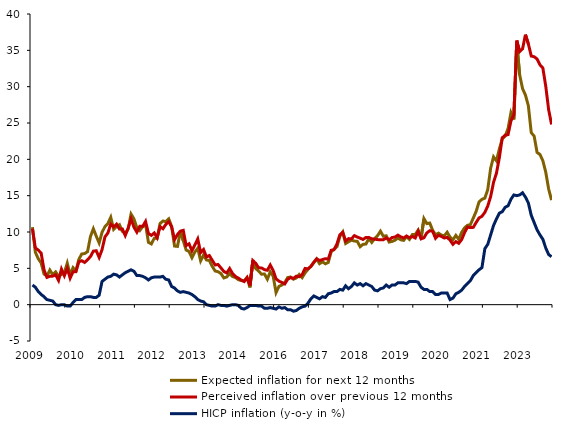
| Category | Expected inflation for next 12 months | Perceived inflation over previous 12 months | HICP inflation (y-o-y in %) |
|---|---|---|---|
| 2009.0 | 10.664 | 10.437 | 2.7 |
| 2009.0 | 7.216 | 7.817 | 2.4 |
| 2009.0 | 6.328 | 7.508 | 1.8 |
| 2009.0 | 5.742 | 7.104 | 1.4 |
| 2009.0 | 4.207 | 4.783 | 1.1 |
| 2009.0 | 3.94 | 3.754 | 0.7 |
| 2009.0 | 4.763 | 3.907 | 0.6 |
| 2009.0 | 4.114 | 3.928 | 0.5 |
| 2009.0 | 4.502 | 4.106 | 0 |
| 2009.0 | 3.904 | 3.337 | -0.1 |
| 2009.0 | 4.159 | 4.896 | 0 |
| 2009.0 | 4.402 | 3.978 | 0 |
| 2010.0 | 5.704 | 4.999 | -0.2 |
| 2010.0 | 4.108 | 3.649 | -0.2 |
| 2010.0 | 5.093 | 4.537 | 0.3 |
| 2010.0 | 4.675 | 4.548 | 0.7 |
| 2010.0 | 6.24 | 5.9 | 0.7 |
| 2010.0 | 6.977 | 6.044 | 0.7 |
| 2010.0 | 7.032 | 5.81 | 1 |
| 2010.0 | 7.3 | 6.188 | 1.1 |
| 2010.0 | 9.369 | 6.615 | 1.1 |
| 2010.0 | 10.447 | 7.367 | 1 |
| 2010.0 | 9.429 | 7.423 | 1 |
| 2010.0 | 8.498 | 6.502 | 1.3 |
| 2011.0 | 9.951 | 7.57 | 3.2 |
| 2011.0 | 10.738 | 9.322 | 3.5 |
| 2011.0 | 11.151 | 9.851 | 3.8 |
| 2011.0 | 12.023 | 11.08 | 3.9 |
| 2011.0 | 10.374 | 10.702 | 4.2 |
| 2011.0 | 10.778 | 11.078 | 4.1 |
| 2011.0 | 11.005 | 10.407 | 3.8 |
| 2011.0 | 10.09 | 10.423 | 4.1 |
| 2011.0 | 9.812 | 9.518 | 4.4 |
| 2011.0 | 10.434 | 10.518 | 4.6 |
| 2011.0 | 12.466 | 11.803 | 4.8 |
| 2011.0 | 11.81 | 10.664 | 4.6 |
| 2012.0 | 10.611 | 9.983 | 4 |
| 2012.0 | 10.208 | 10.792 | 4 |
| 2012.0 | 10.734 | 10.773 | 3.9 |
| 2012.0 | 11.057 | 11.453 | 3.7 |
| 2012.0 | 8.578 | 9.795 | 3.4 |
| 2012.0 | 8.356 | 9.534 | 3.7 |
| 2012.0 | 9.132 | 9.868 | 3.8 |
| 2012.0 | 9.145 | 9.213 | 3.8 |
| 2012.0 | 11.176 | 10.728 | 3.8 |
| 2012.0 | 11.511 | 10.449 | 3.9 |
| 2012.0 | 11.43 | 11.053 | 3.5 |
| 2012.0 | 11.807 | 11.424 | 3.4 |
| 2013.0 | 10.748 | 10.701 | 2.5 |
| 2013.0 | 8.063 | 8.955 | 2.3 |
| 2013.0 | 8.019 | 9.657 | 1.9 |
| 2013.0 | 10.023 | 10.121 | 1.7 |
| 2013.0 | 8.809 | 10.223 | 1.8 |
| 2013.0 | 7.522 | 8.128 | 1.7 |
| 2013.0 | 7.311 | 8.373 | 1.6 |
| 2013.0 | 6.462 | 7.415 | 1.4 |
| 2013.0 | 7.242 | 8.229 | 1.1 |
| 2013.0 | 7.762 | 9.041 | 0.7 |
| 2013.0 | 6.027 | 7.163 | 0.5 |
| 2013.0 | 6.841 | 7.595 | 0.4 |
| 2014.0 | 6.151 | 6.567 | 0 |
| 2014.0 | 6.09 | 6.757 | -0.1 |
| 2014.0 | 5.265 | 6.108 | -0.2 |
| 2014.0 | 4.635 | 5.465 | -0.2 |
| 2014.0 | 4.534 | 5.531 | 0 |
| 2014.0 | 4.284 | 5.059 | -0.1 |
| 2014.0 | 3.677 | 4.569 | -0.1 |
| 2014.0 | 3.809 | 4.365 | -0.2 |
| 2014.0 | 4.271 | 4.973 | -0.1 |
| 2014.0 | 3.866 | 4.282 | 0 |
| 2014.0 | 3.74 | 3.871 | 0 |
| 2014.0 | 3.438 | 3.652 | -0.1 |
| 2015.0 | 3.317 | 3.386 | -0.5 |
| 2015.0 | 3.257 | 3.18 | -0.6 |
| 2015.0 | 3.739 | 3.72 | -0.4 |
| 2015.0 | 2.37 | 2.628 | -0.1 |
| 2015.0 | 6.101 | 6.068 | -0.1 |
| 2015.0 | 4.983 | 5.687 | -0.1 |
| 2015.0 | 4.606 | 5.07 | -0.2 |
| 2015.0 | 4.191 | 5.056 | -0.2 |
| 2015.0 | 4.226 | 4.819 | -0.5 |
| 2015.0 | 3.501 | 4.733 | -0.5 |
| 2015.0 | 4.518 | 5.452 | -0.4 |
| 2015.0 | 3.932 | 4.702 | -0.5 |
| 2016.0 | 1.665 | 3.553 | -0.6 |
| 2016.0 | 2.519 | 3.239 | -0.3 |
| 2016.0 | 2.701 | 3.052 | -0.5 |
| 2016.0 | 3.044 | 2.847 | -0.4 |
| 2016.0 | 3.728 | 3.482 | -0.7 |
| 2016.0 | 3.812 | 3.73 | -0.7 |
| 2016.0 | 3.501 | 3.619 | -0.9 |
| 2016.0 | 3.68 | 3.921 | -0.8 |
| 2016.0 | 4.156 | 3.849 | -0.5 |
| 2016.0 | 3.719 | 4.141 | -0.3 |
| 2016.0 | 4.369 | 4.985 | -0.2 |
| 2016.0 | 4.871 | 4.924 | 0.2 |
| 2017.0 | 5.243 | 5.269 | 0.8 |
| 2017.0 | 5.762 | 5.835 | 1.2 |
| 2017.0 | 6.301 | 6.304 | 1 |
| 2017.0 | 5.642 | 6.075 | 0.8 |
| 2017.0 | 5.893 | 6.212 | 1.1 |
| 2017.0 | 5.63 | 6.324 | 1 |
| 2017.0 | 5.805 | 6.274 | 1.5 |
| 2017.0 | 7.277 | 7.48 | 1.6 |
| 2017.0 | 7.634 | 7.569 | 1.8 |
| 2017.0 | 7.978 | 8.351 | 1.8 |
| 2017.0 | 9.398 | 9.613 | 2.1 |
| 2017.0 | 9.997 | 9.955 | 2 |
| 2018.0 | 8.415 | 8.764 | 2.6 |
| 2018.0 | 8.658 | 9.09 | 2.2 |
| 2018.0 | 8.874 | 9.059 | 2.5 |
| 2018.0 | 8.756 | 9.5 | 3 |
| 2018.0 | 8.717 | 9.307 | 2.7 |
| 2018.0 | 7.977 | 9.15 | 2.9 |
| 2018.0 | 8.302 | 8.976 | 2.6 |
| 2018.0 | 8.351 | 9.253 | 2.9 |
| 2018.0 | 9.105 | 9.245 | 2.7 |
| 2018.0 | 8.565 | 9.063 | 2.5 |
| 2018.0 | 9.09 | 9.012 | 2 |
| 2018.0 | 9.495 | 8.953 | 1.9 |
| 2019.0 | 10.112 | 8.929 | 2.2 |
| 2019.0 | 9.412 | 8.94 | 2.3 |
| 2019.0 | 9.48 | 9.182 | 2.7 |
| 2019.0 | 8.616 | 8.927 | 2.4 |
| 2019.0 | 8.704 | 9.238 | 2.7 |
| 2019.0 | 8.867 | 9.304 | 2.7 |
| 2019.0 | 9.177 | 9.57 | 3 |
| 2019.0 | 8.928 | 9.334 | 3 |
| 2019.0 | 8.844 | 9.177 | 3 |
| 2019.0 | 9.361 | 9.45 | 2.9 |
| 2019.0 | 8.985 | 9.212 | 3.2 |
| 2019.0 | 9.644 | 9.374 | 3.2 |
| 2020.0 | 9.664 | 9.174 | 3.2 |
| 2020.0 | 10.252 | 10.117 | 3.1 |
| 2020.0 | 9.136 | 9.058 | 2.4 |
| 2020.0 | 11.84 | 9.209 | 2.1 |
| 2020.0 | 11.158 | 9.873 | 2.1 |
| 2020.0 | 11.23 | 10.179 | 1.8 |
| 2020.0 | 10.236 | 10.092 | 1.8 |
| 2020.0 | 9.616 | 9.131 | 1.4 |
| 2020.0 | 9.843 | 9.537 | 1.4 |
| 2020.0 | 9.581 | 9.395 | 1.6 |
| 2020.0 | 9.476 | 9.175 | 1.6 |
| 2020.0 | 9.969 | 9.265 | 1.6 |
| 2021.0 | 9.288 | 8.88 | 0.7 |
| 2021.0 | 8.933 | 8.305 | 0.9 |
| 2021.0 | 9.532 | 8.679 | 1.5 |
| 2021.0 | 8.973 | 8.442 | 1.7 |
| 2021.0 | 9.945 | 8.951 | 2 |
| 2021.0 | 10.574 | 9.914 | 2.5 |
| 2021.0 | 10.917 | 10.676 | 2.9 |
| 2021.0 | 11.012 | 10.6 | 3.3 |
| 2021.0 | 11.905 | 10.638 | 4 |
| 2021.0 | 12.84 | 11.31 | 4.4 |
| 2021.0 | 14.144 | 11.936 | 4.8 |
| 2021.0 | 14.501 | 12.163 | 5.1 |
| 2022.0 | 14.66 | 12.701 | 7.7 |
| 2022.0 | 15.834 | 13.571 | 8.3 |
| 2022.0 | 18.781 | 14.877 | 9.6 |
| 2022.0 | 20.34 | 16.839 | 10.9 |
| 2022.0 | 19.79 | 18.093 | 11.8 |
| 2022.0 | 21.42 | 20.22 | 12.6 |
| 2022.0 | 22.825 | 22.963 | 12.8 |
| 2022.0 | 23.194 | 23.327 | 13.4 |
| 2022.0 | 24.227 | 23.396 | 13.6 |
| 2022.0 | 26.414 | 25.284 | 14.5 |
| 2022.0 | 25.474 | 26.129 | 15.1 |
| 2022.0 | 36.058 | 36.356 | 15 |
| 2023.0 | 31.629 | 34.812 | 15.1 |
| 2023.0 | 29.732 | 35.206 | 15.4 |
| 2023.0 | 28.844 | 37.156 | 14.8 |
| 2023.0 | 27.382 | 35.894 | 14 |
| 2023.0 | 23.668 | 34.214 | 12.3 |
| 2023.0 | 23.196 | 34.119 | 11.3 |
| 2023.0 | 20.963 | 33.811 | 10.3 |
| 2023.0 | 20.673 | 33.009 | 9.6 |
| 2023.0 | 19.815 | 32.572 | 9 |
| 2023.0 | 18.235 | 30.071 | 7.8 |
| 2023.0 | 15.916 | 26.831 | 6.9 |
| 2023.0 | 14.4 | 24.8 | 6.6 |